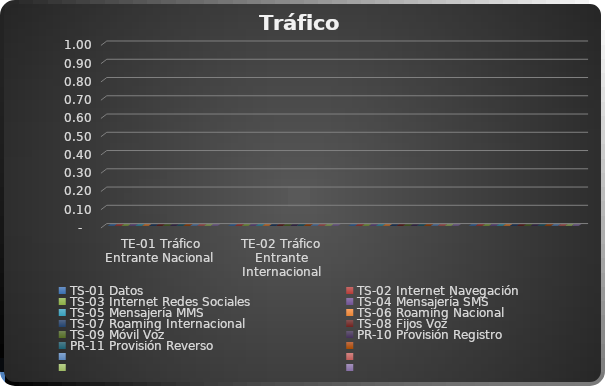
| Category | TS-01 Datos | TS-02 Internet Navegación | TS-03 Internet Redes Sociales | TS-04 Mensajería SMS | TS-05 Mensajería MMS | TS-06 Roaming Nacional | TS-07 Roaming Internacional | TS-08 Fijos Voz | TS-09 Móvil Voz | PR-10 Provisión Registro | PR-11 Provisión Reverso | Series 11 | Series 12 | Series 13 | Series 14 | Series 15 |
|---|---|---|---|---|---|---|---|---|---|---|---|---|---|---|---|---|
| TE-01 Tráfico Entrante Nacional  | 0 | 0 | 0 | 0 | 0 | 0 | 0 | 0 | 0 | 0 | 0 | 0 | 0 | 0 | 0 | 0 |
| TE-02 Tráfico Entrante Internacional | 0 | 0 | 0 | 0 | 0 | 0 | 0 | 0 | 0 | 0 | 0 | 0 | 0 | 0 | 0 | 0 |